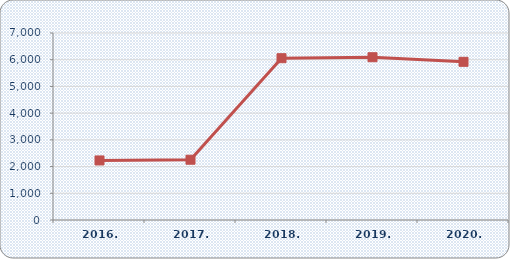
| Category | Broj zaposlenih |
|---|---|
| 2016. | 2229 |
| 2017. | 2256 |
| 2018. | 6056 |
| 2019. | 6093 |
| 2020. | 5921 |